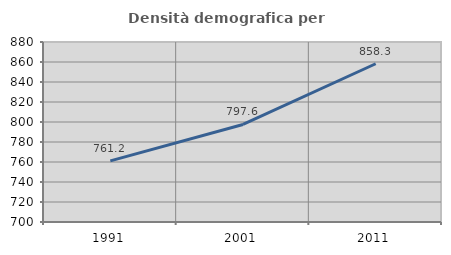
| Category | Densità demografica |
|---|---|
| 1991.0 | 761.151 |
| 2001.0 | 797.563 |
| 2011.0 | 858.251 |